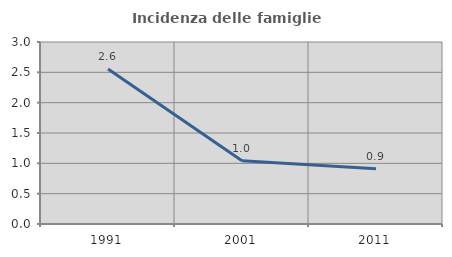
| Category | Incidenza delle famiglie numerose |
|---|---|
| 1991.0 | 2.556 |
| 2001.0 | 1.042 |
| 2011.0 | 0.91 |